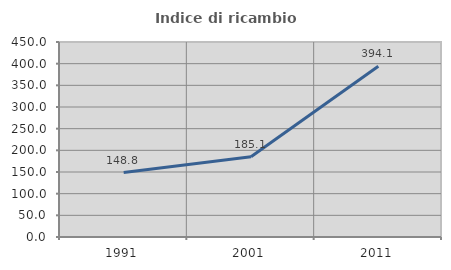
| Category | Indice di ricambio occupazionale  |
|---|---|
| 1991.0 | 148.837 |
| 2001.0 | 185.143 |
| 2011.0 | 394.074 |